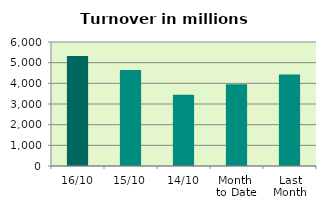
| Category | Series 0 |
|---|---|
| 16/10 | 5327.782 |
| 15/10 | 4645.645 |
| 14/10 | 3445.583 |
| Month 
to Date | 3958.628 |
| Last
Month | 4425.778 |